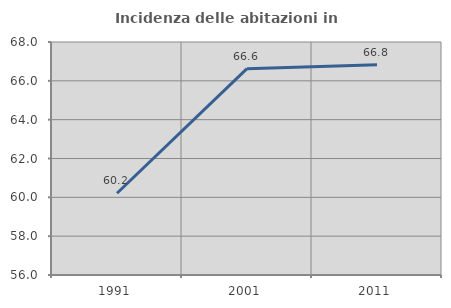
| Category | Incidenza delle abitazioni in proprietà  |
|---|---|
| 1991.0 | 60.21 |
| 2001.0 | 66.626 |
| 2011.0 | 66.834 |